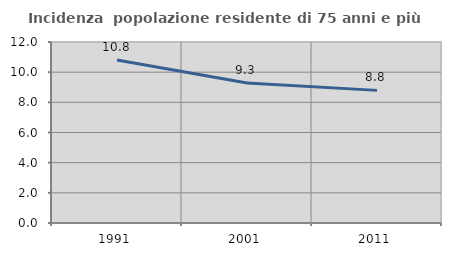
| Category | Incidenza  popolazione residente di 75 anni e più |
|---|---|
| 1991.0 | 10.813 |
| 2001.0 | 9.283 |
| 2011.0 | 8.793 |